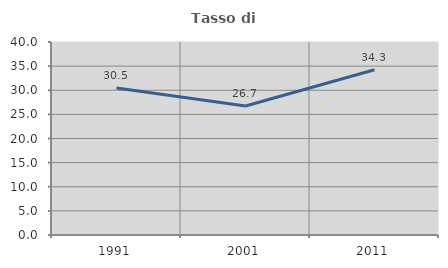
| Category | Tasso di occupazione   |
|---|---|
| 1991.0 | 30.484 |
| 2001.0 | 26.735 |
| 2011.0 | 34.253 |